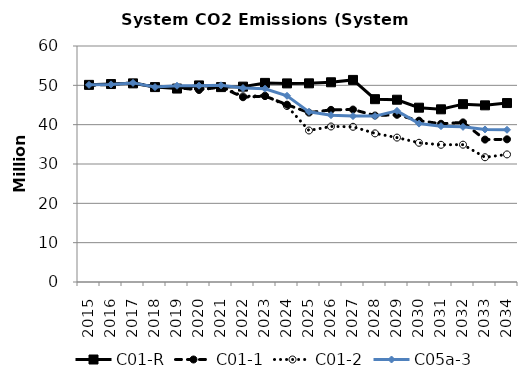
| Category | C01-R | C01-1 | C01-2 | C05a-3 |
|---|---|---|---|---|
| 2015.0 | 50.118 | 49.98 | 50.118 | 50.118 |
| 2016.0 | 50.329 | 50.239 | 50.238 | 50.238 |
| 2017.0 | 50.499 | 50.623 | 50.622 | 50.622 |
| 2018.0 | 49.555 | 49.637 | 49.636 | 49.552 |
| 2019.0 | 49.181 | 49.422 | 49.421 | 49.894 |
| 2020.0 | 49.976 | 48.827 | 48.938 | 49.913 |
| 2021.0 | 49.548 | 49.578 | 49.665 | 50.013 |
| 2022.0 | 49.671 | 46.971 | 47.203 | 49.312 |
| 2023.0 | 50.618 | 47.262 | 47.383 | 49.132 |
| 2024.0 | 50.491 | 45.086 | 44.746 | 47.347 |
| 2025.0 | 50.508 | 43.063 | 38.519 | 43.259 |
| 2026.0 | 50.777 | 43.764 | 39.539 | 42.413 |
| 2027.0 | 51.38 | 43.847 | 39.462 | 42.177 |
| 2028.0 | 46.481 | 42.329 | 37.785 | 42.179 |
| 2029.0 | 46.342 | 42.511 | 36.715 | 43.503 |
| 2030.0 | 44.317 | 41.021 | 35.397 | 40.272 |
| 2031.0 | 43.901 | 40.228 | 34.881 | 39.619 |
| 2032.0 | 45.215 | 40.585 | 34.915 | 39.44 |
| 2033.0 | 44.915 | 36.207 | 31.713 | 38.785 |
| 2034.0 | 45.496 | 36.272 | 32.435 | 38.699 |